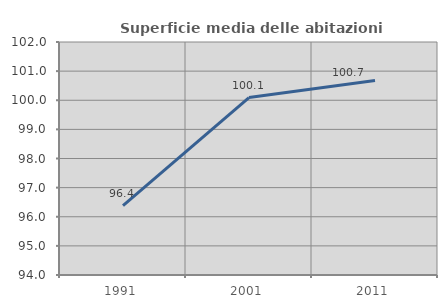
| Category | Superficie media delle abitazioni occupate |
|---|---|
| 1991.0 | 96.384 |
| 2001.0 | 100.093 |
| 2011.0 | 100.68 |